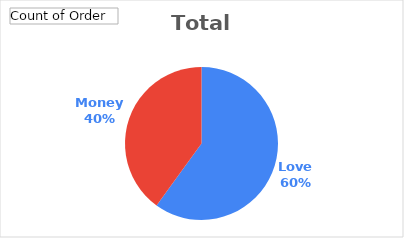
| Category | Total |
|---|---|
| Love | 6 |
| Money | 4 |